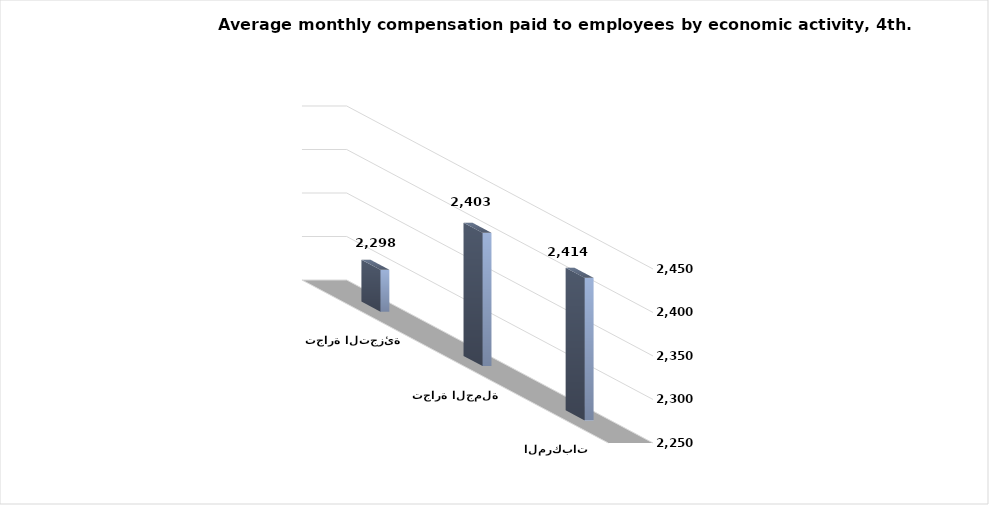
| Category | متوسط التعويضات  |
|---|---|
| بيع وإصلاح المركبات  | 2413.842 |
| تجارة الجملة | 2403.169 |
| تجارة التجزئة | 2298.231 |